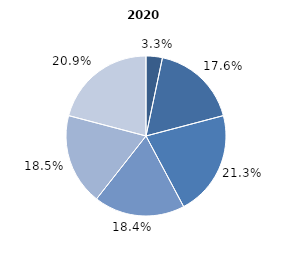
| Category | 2020 |
|---|---|
| până la 25 ani | 3.3 |
| 25-34 ani | 17.6 |
| 35-44 ani | 21.3 |
| 45-54 ani | 18.4 |
| 55-64 ani | 18.5 |
| 65 ani şi peste | 20.9 |